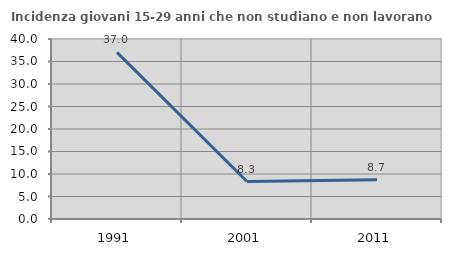
| Category | Incidenza giovani 15-29 anni che non studiano e non lavorano  |
|---|---|
| 1991.0 | 37.02 |
| 2001.0 | 8.333 |
| 2011.0 | 8.696 |